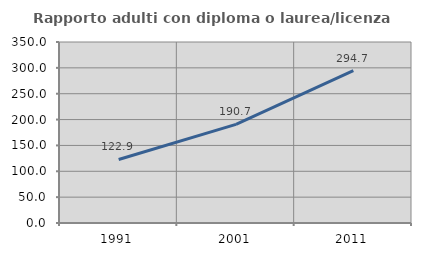
| Category | Rapporto adulti con diploma o laurea/licenza media  |
|---|---|
| 1991.0 | 122.898 |
| 2001.0 | 190.689 |
| 2011.0 | 294.67 |